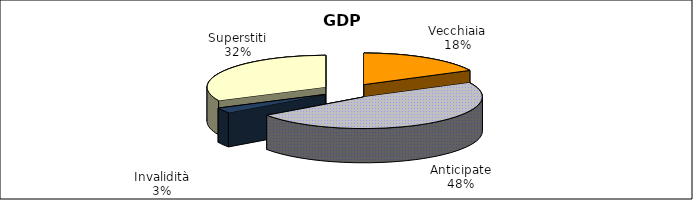
| Category | Series 0 |
|---|---|
| Vecchiaia | 7544 |
| Anticipate | 20458 |
| Invalidità | 1169 |
| Superstiti | 13784 |